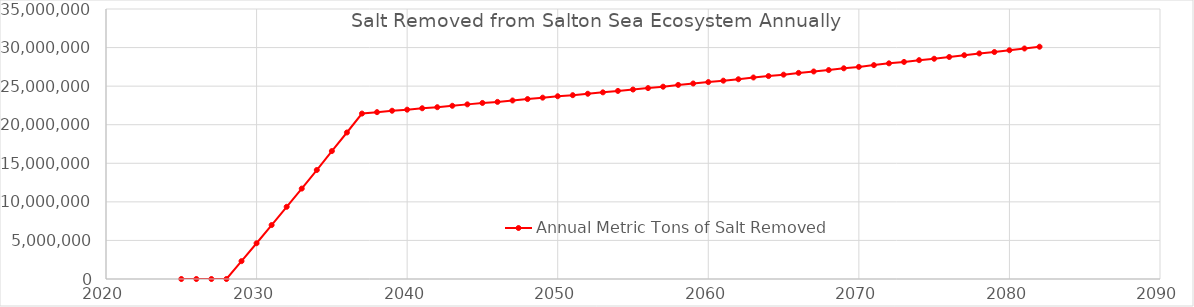
| Category | Annual Metric Tons of Salt Removed |
|---|---|
| 2025.0 | 0 |
| 2026.0 | 0 |
| 2027.0 | 0 |
| 2028.0 | 0 |
| 2029.0 | 2316559.749 |
| 2030.0 | 4633119.498 |
| 2031.0 | 6995525.368 |
| 2032.0 | 9357931.238 |
| 2033.0 | 11720337.109 |
| 2034.0 | 14128589.1 |
| 2035.0 | 16582687.212 |
| 2036.0 | 18990939.203 |
| 2037.0 | 21445037.315 |
| 2038.0 | 21628421.799 |
| 2039.0 | 21811806.283 |
| 2040.0 | 21949344.646 |
| 2041.0 | 22132729.13 |
| 2042.0 | 22270267.494 |
| 2043.0 | 22453651.978 |
| 2044.0 | 22637036.462 |
| 2045.0 | 22820420.946 |
| 2046.0 | 22957959.309 |
| 2047.0 | 23141343.793 |
| 2048.0 | 23324728.277 |
| 2049.0 | 23508112.761 |
| 2050.0 | 23691497.245 |
| 2051.0 | 23829035.608 |
| 2052.0 | 24012420.092 |
| 2053.0 | 24195804.576 |
| 2054.0 | 24379189.06 |
| 2055.0 | 24562573.544 |
| 2056.0 | 24745958.028 |
| 2057.0 | 24929342.512 |
| 2058.0 | 25158573.118 |
| 2059.0 | 25341957.602 |
| 2060.0 | 25525342.086 |
| 2061.0 | 25708726.57 |
| 2062.0 | 25892111.054 |
| 2063.0 | 26121341.659 |
| 2064.0 | 26304726.143 |
| 2065.0 | 26488110.627 |
| 2066.0 | 26717341.232 |
| 2067.0 | 26900725.716 |
| 2068.0 | 27084110.2 |
| 2069.0 | 27313340.805 |
| 2070.0 | 27496725.289 |
| 2071.0 | 27725955.894 |
| 2072.0 | 27955186.499 |
| 2073.0 | 28138570.984 |
| 2074.0 | 28367801.589 |
| 2075.0 | 28551186.073 |
| 2076.0 | 28780416.678 |
| 2077.0 | 29009647.283 |
| 2078.0 | 29238877.888 |
| 2079.0 | 29422262.372 |
| 2080.0 | 29651492.977 |
| 2081.0 | 29880723.582 |
| 2082.0 | 30109954.187 |